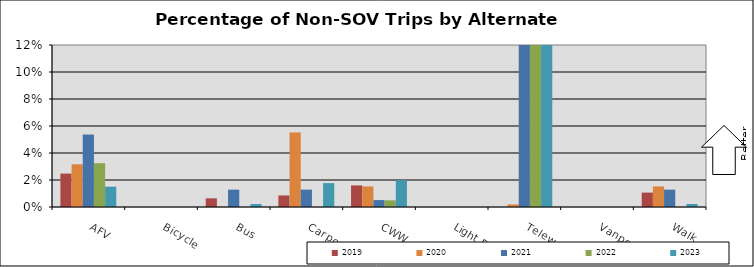
| Category | 2019 | 2020 | 2021 | 2022 | 2023 |
|---|---|---|---|---|---|
| AFV | 0.025 | 0.032 | 0.054 | 0.032 | 0.015 |
| Bicycle | 0 | 0 | 0 | 0 | 0 |
| Bus | 0.006 | 0 | 0.013 | 0 | 0.002 |
| Carpool | 0.009 | 0.055 | 0.013 | 0 | 0.018 |
| CWW | 0.016 | 0.015 | 0.005 | 0.005 | 0.02 |
| Light Rail | 0 | 0 | 0 | 0 | 0 |
| Telework | 0 | 0.002 | 0.424 | 0.483 | 0.555 |
| Vanpool | 0 | 0 | 0 | 0 | 0 |
| Walk | 0.011 | 0.015 | 0.013 | 0 | 0.002 |